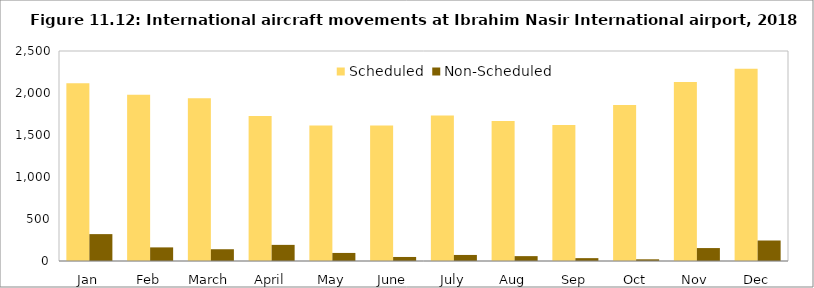
| Category | Scheduled | Non-Scheduled |
|---|---|---|
| Jan | 2116 | 320 |
| Feb | 1980 | 162 |
| March | 1938 | 140 |
| April | 1726 | 192 |
| May | 1614 | 96 |
| June | 1612 | 48 |
| July | 1732 | 72 |
| Aug | 1666 | 58 |
| Sep | 1618 | 34 |
| Oct | 1856 | 20 |
| Nov | 2132 | 154 |
| Dec | 2290 | 244 |